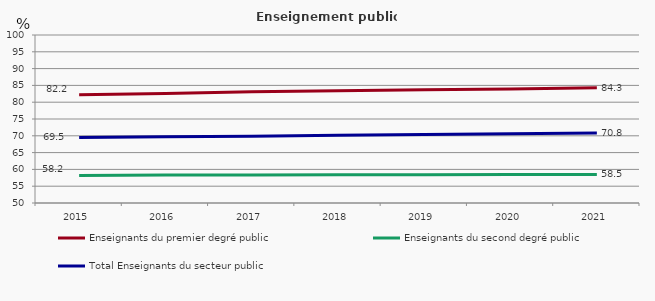
| Category | Enseignants du premier degré public | Enseignants du second degré public | Total Enseignants du secteur public |
|---|---|---|---|
| 2015.0 | 82.2 | 58.2 | 69.5 |
| 2016.0 | 82.6 | 58.3 | 69.7 |
| 2017.0 | 83.1 | 58.3 | 69.9 |
| 2018.0 | 83.4 | 58.4 | 70.2 |
| 2019.0 | 83.7 | 58.4 | 70.4 |
| 2020.0 | 83.9 | 58.5 | 70.6 |
| 2021.0 | 84.3 | 58.5 | 70.8 |